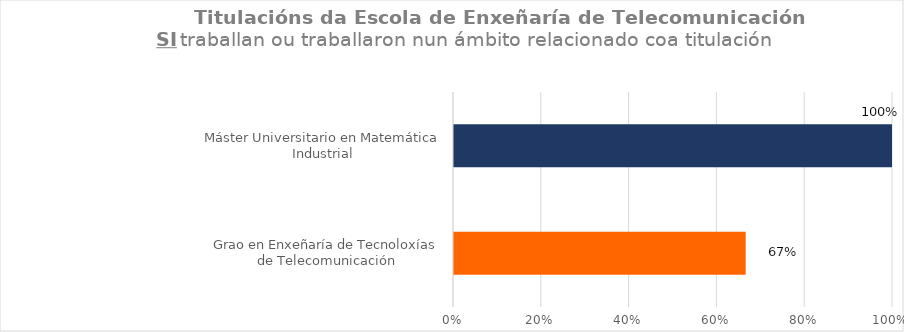
| Category | Series 1 |
|---|---|
| Grao en Enxeñaría de Tecnoloxías de Telecomunicación | 0.667 |
| Máster Universitario en Matemática Industrial | 1 |